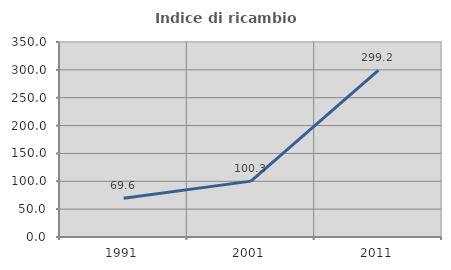
| Category | Indice di ricambio occupazionale  |
|---|---|
| 1991.0 | 69.577 |
| 2001.0 | 100.296 |
| 2011.0 | 299.17 |